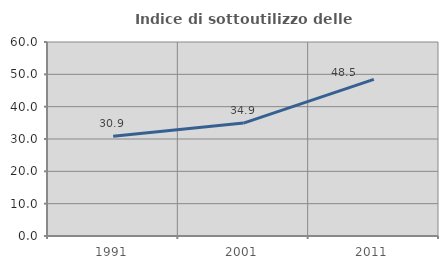
| Category | Indice di sottoutilizzo delle abitazioni  |
|---|---|
| 1991.0 | 30.867 |
| 2001.0 | 34.933 |
| 2011.0 | 48.454 |